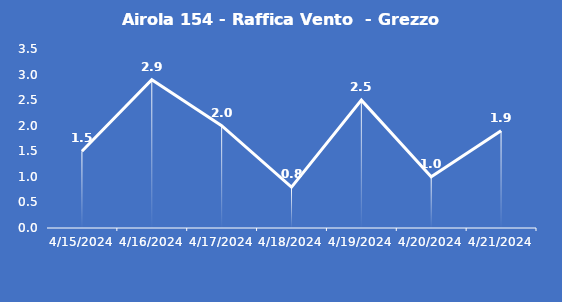
| Category | Airola 154 - Raffica Vento  - Grezzo (m/s) |
|---|---|
| 4/15/24 | 1.5 |
| 4/16/24 | 2.9 |
| 4/17/24 | 2 |
| 4/18/24 | 0.8 |
| 4/19/24 | 2.5 |
| 4/20/24 | 1 |
| 4/21/24 | 1.9 |